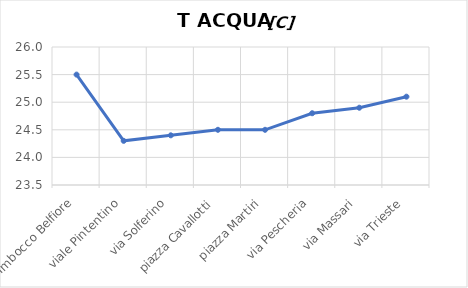
| Category | T ACQUA [C] |
|---|---|
| Imbocco Belfiore | 25.5 |
| viale Pintentino | 24.3 |
| via Solferino | 24.4 |
| piazza Cavallotti | 24.5 |
| piazza Martiri | 24.5 |
| via Pescheria | 24.8 |
| via Massari | 24.9 |
| via Trieste | 25.1 |